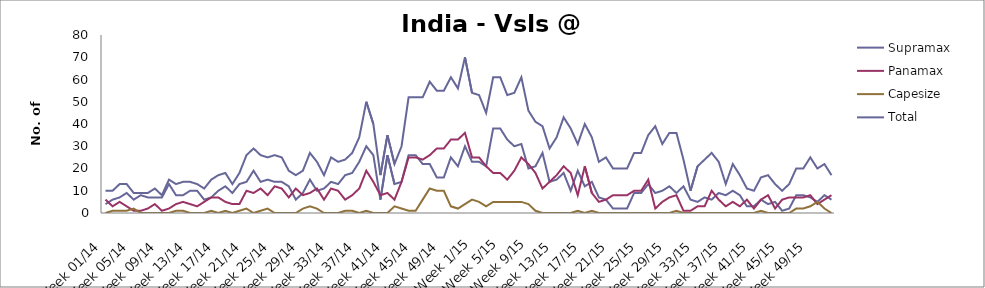
| Category | Supramax | Panamax | Capesize | Total |
|---|---|---|---|---|
| Week 01/14 | 4 | 6 | 0 | 10 |
| Week 02/14 | 6 | 3 | 1 | 10 |
| Week 03/14 | 7 | 5 | 1 | 13 |
| Week 04/14 | 9 | 3 | 1 | 13 |
| Week 05/14 | 6 | 1 | 2 | 9 |
| Week 06/14 | 8 | 1 | 0 | 9 |
| Week 07/14 | 7 | 2 | 0 | 9 |
| Week 08/14 | 7 | 4 | 0 | 11 |
| Week 09/14 | 7 | 1 | 0 | 8 |
| Week 10/14 | 13 | 2 | 0 | 15 |
| Week 11/14 | 8 | 4 | 1 | 13 |
| Week 12/14 | 8 | 5 | 1 | 14 |
| Week 13/14 | 10 | 4 | 0 | 14 |
| Week 14/14 | 10 | 3 | 0 | 13 |
| Week 15/14 | 6 | 5 | 0 | 11 |
| Week 16/14 | 7 | 7 | 1 | 15 |
| Week 17/14 | 10 | 7 | 0 | 17 |
| Week 18/14 | 12 | 5 | 1 | 18 |
| Week 19/14 | 9 | 4 | 0 | 13 |
| Week 20/14 | 13 | 4 | 1 | 18 |
| Week 21/14 | 14 | 10 | 2 | 26 |
| Week 22/14 | 19 | 9 | 0 | 29 |
| Week 23/14 | 14 | 11 | 1 | 26 |
| Week 24/14 | 15 | 8 | 2 | 25 |
| Week 25/14 | 14 | 12 | 0 | 26 |
| Week 26/14 | 14 | 11 | 0 | 25 |
| Week 27/14 | 12 | 7 | 0 | 19 |
| Week 28/14 | 6 | 11 | 0 | 17 |
| Week 29/14 | 9 | 8 | 2 | 19 |
| Week 30/14 | 15 | 9 | 3 | 27 |
| Week 31/14 | 10 | 11 | 2 | 23 |
| Week 32/14 | 11 | 6 | 0 | 17 |
| Week 33/14 | 14 | 11 | 0 | 25 |
| Week 34/14 | 13 | 10 | 0 | 23 |
| Week 35/14 | 17 | 6 | 1 | 24 |
| Week 36/14 | 18 | 8 | 1 | 27 |
| Week 37/14 | 23 | 11 | 0 | 34 |
| Week 38/14 | 30 | 19 | 1 | 50 |
| Week 39/14 | 26 | 14 | 0 | 40 |
| Week 40/14 | 6 | 8 | 0 | 17 |
| Week 41/14 | 26 | 9 | 0 | 35 |
| Week 42/14 | 13 | 6 | 3 | 22 |
| Week 43/14 | 14 | 14 | 2 | 30 |
| Week 44/14 | 26 | 25 | 1 | 52 |
| Week 45/14 | 26 | 25 | 1 | 52 |
| Week 46/14 | 22 | 24 | 6 | 52 |
| Week 47/14 | 22 | 26 | 11 | 59 |
| Week 48/14 | 16 | 29 | 10 | 55 |
| Week 49/14 | 16 | 29 | 10 | 55 |
| Week 50/14 | 25 | 33 | 3 | 61 |
| Week 51/14 | 21 | 33 | 2 | 56 |
| Week 52/14 | 30 | 36 | 4 | 70 |
| Week 1/15 | 23 | 25 | 6 | 54 |
| Week 2/15 | 23 | 25 | 5 | 53 |
| Week 3/15 | 21 | 21 | 3 | 45 |
| Week 4/15 | 38 | 18 | 5 | 61 |
| Week 5/15 | 38 | 18 | 5 | 61 |
| Week 6/15 | 33 | 15 | 5 | 53 |
| Week 7/15 | 30 | 19 | 5 | 54 |
| Week 8/15 | 31 | 25 | 5 | 61 |
| Week 9/15 | 20 | 22 | 4 | 46 |
| Week 10/15 | 21 | 18 | 1 | 41 |
| Week 11/15 | 27 | 11 | 0 | 39 |
| Week 12/15 | 14 | 14 | 0 | 29 |
| Week 13/15 | 15 | 17 | 0 | 34 |
| Week 14/15 | 18 | 21 | 0 | 43 |
| Week 15/15 | 10 | 18 | 0 | 38 |
| Week 16/15 | 19 | 8 | 1 | 31 |
| Week 17/15 | 12 | 21 | 0 | 40 |
| Week 18/15 | 14 | 9 | 1 | 34 |
| Week 19/15 | 7 | 5 | 0 | 23 |
| Week 20/15 | 6 | 6 | 0 | 25 |
| Week 21/15 | 2 | 8 | 0 | 20 |
| Week 22/15 | 2 | 8 | 0 | 20 |
| Week 23/15 | 2 | 8 | 0 | 20 |
| Week 24/15 | 9 | 10 | 0 | 27 |
| Week 25/15 | 9 | 10 | 0 | 27 |
| Week 26/15 | 13 | 15 | 0 | 35 |
| Week 27/15 | 9 | 2 | 0 | 39 |
| Week 28/15 | 10 | 5 | 0 | 31 |
| Week 29/15 | 12 | 7 | 0 | 36 |
| Week 30/15 | 9 | 8 | 1 | 36 |
| Week 31/15 | 12 | 1 | 0 | 24 |
| Week 32/15 | 6 | 1 | 0 | 10 |
| Week 33/15 | 5 | 3 | 0 | 21 |
| Week 34/15 | 7 | 3 | 0 | 24 |
| Week 35/15 | 6 | 10 | 0 | 27 |
| Week 36/15 | 9 | 6 | 0 | 23 |
| Week 37/15 | 8 | 3 | 0 | 13 |
| Week 38/15 | 10 | 5 | 0 | 22 |
| Week 39/15 | 8 | 3 | 0 | 17 |
| Week 40/15 | 3 | 6 | 0 | 11 |
| Week 41/15 | 3 | 2 | 0 | 10 |
| Week 42/15 | 6 | 6 | 1 | 16 |
| Week 43/15 | 4 | 8 | 0 | 17 |
| Week 44/15 | 5 | 2 | 0 | 13 |
| Week 45/15 | 1 | 6 | 0 | 10 |
| Week 46/15 | 2 | 7 | 0 | 13 |
| Week 47/15 | 8 | 7 | 2 | 20 |
| Week 48/15 | 8 | 7 | 2 | 20 |
| Week 49/15 | 7 | 8 | 3 | 25 |
| Week 50/15 | 5 | 4 | 5 | 20 |